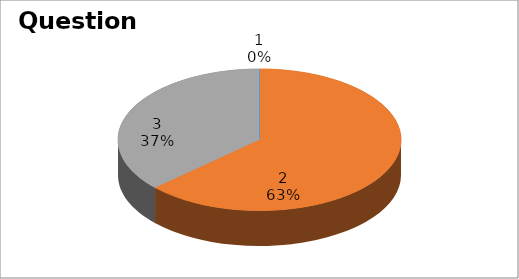
| Category | Series 0 |
|---|---|
| 0 | 0 |
| 1 | 12 |
| 2 | 7 |